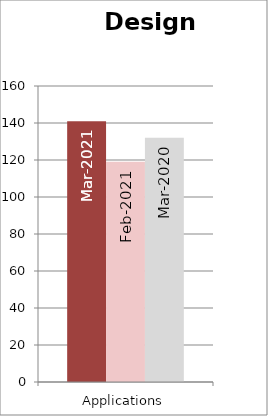
| Category | Mar-2021 | Feb-2021 | Mar-2020 |
|---|---|---|---|
| Applications | 141 | 119 | 132 |